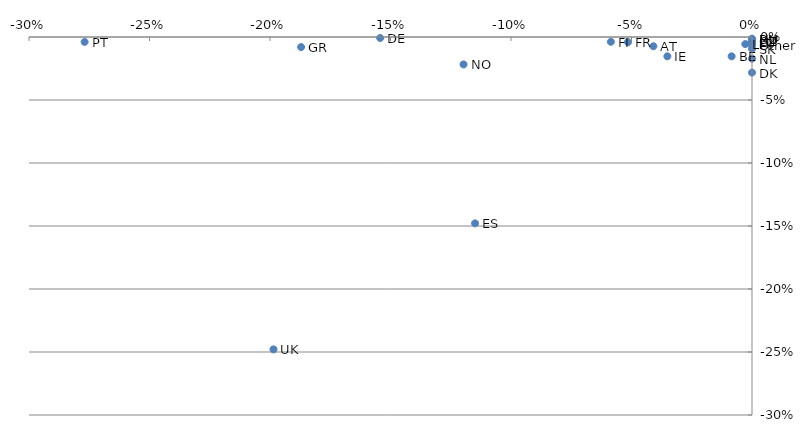
| Category | Series 0 |
|---|---|
| -0.04091385316645123 | -0.007 |
| -0.008454307211745558 | -0.015 |
| 0.0 | -0.001 |
| 0.0 | -0.003 |
| 0.0 | -0.028 |
| -0.058555802626452706 | -0.004 |
| -0.05147543969846111 | -0.004 |
| -0.1542886250111327 | -0.001 |
| -0.18708804143126176 | -0.008 |
| 0.0 | -0.001 |
| -0.035122657926303875 | -0.015 |
| 0.0 | -0.005 |
| -0.0027792351431447896 | -0.006 |
| 0.0 | -0.004 |
| 0.0 | -0.017 |
| -0.11969639075442494 | -0.022 |
| 0.0 | -0.007 |
| -0.2769303852853178 | -0.004 |
| 0.0 | -0.009 |
| -0.11491758885529146 | -0.148 |
| -0.19854912992048712 | -0.248 |